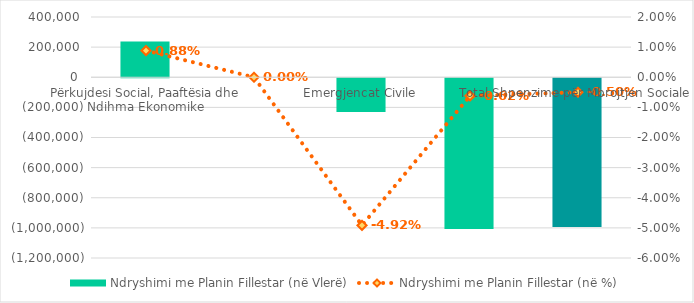
| Category | Ndryshimi me Planin Fillestar (në Vlerë) |
|---|---|
| Përkujdesi Social, Paaftësia dhe Ndihma Ekonomike | 237400 |
| Mbështetje Sociale për Ushtarakët | 0 |
| Emergjencat Civile | -224200 |
| Sigurimet Shoqërore, Pensionet dhe Papunësia | -1000000 |
| Total Shpenzime për Mbrojtjen Sociale | -986800 |